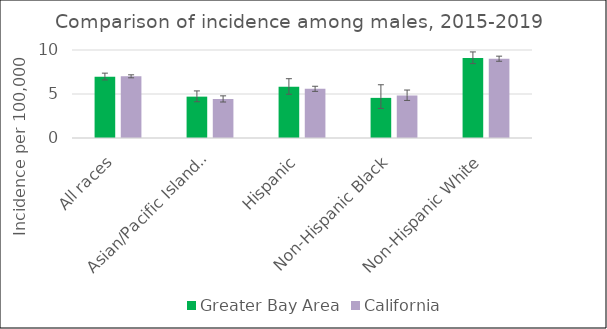
| Category | Greater Bay Area | California | SEER 18 |
|---|---|---|---|
| All races | 6.97 | 7.01 |  |
| Asian/Pacific Islander | 4.7 | 4.43 |  |
| Hispanic | 5.81 | 5.59 |  |
| Non-Hispanic Black | 4.56 | 4.83 |  |
| Non-Hispanic White | 9.09 | 9.01 |  |